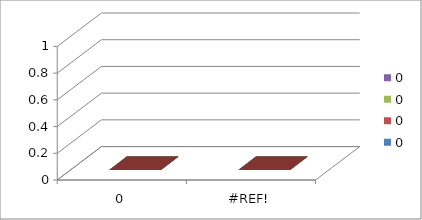
| Category | 0 |
|---|---|
| 0.0 | 0 |
| 0.0 | 0 |